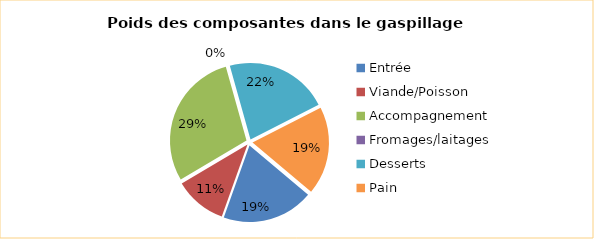
| Category | Series 1 |
|---|---|
| Entrée | 0.193 |
| Viande/Poisson | 0.11 |
| Accompagnement | 0.292 |
| Fromages/laitages | 0 |
| Desserts | 0.218 |
| Pain | 0.186 |